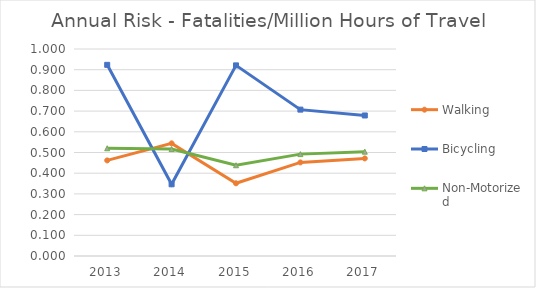
| Category | Walking | Bicycling | Non-Motorized |
|---|---|---|---|
| 2013 | 0.462 | 0.923 | 0.521 |
| 2014 | 0.544 | 0.346 | 0.517 |
| 2015 | 0.351 | 0.921 | 0.438 |
| 2016 | 0.452 | 0.707 | 0.492 |
| 2017 | 0.471 | 0.679 | 0.504 |